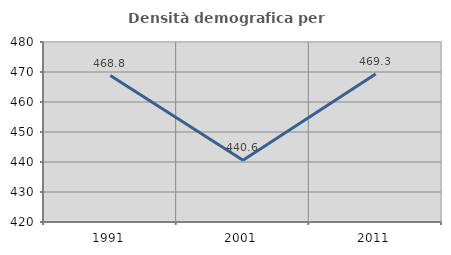
| Category | Densità demografica |
|---|---|
| 1991.0 | 468.807 |
| 2001.0 | 440.614 |
| 2011.0 | 469.345 |